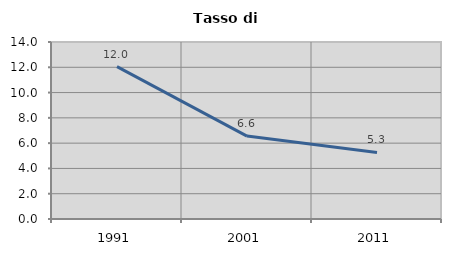
| Category | Tasso di disoccupazione   |
|---|---|
| 1991.0 | 12.048 |
| 2001.0 | 6.557 |
| 2011.0 | 5.263 |